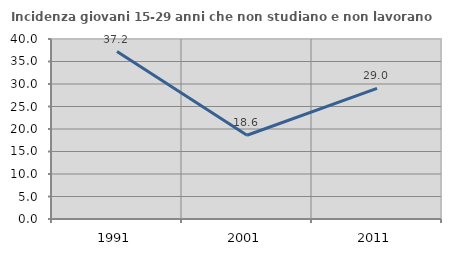
| Category | Incidenza giovani 15-29 anni che non studiano e non lavorano  |
|---|---|
| 1991.0 | 37.216 |
| 2001.0 | 18.605 |
| 2011.0 | 29.032 |